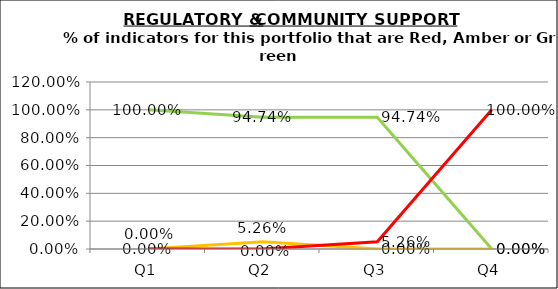
| Category | Green | Amber | Red |
|---|---|---|---|
| Q1 | 1 | 0 | 0 |
| Q2 | 0.947 | 0.053 | 0 |
| Q3 | 0.947 | 0 | 0.053 |
| Q4 | 0 | 0 | 1 |